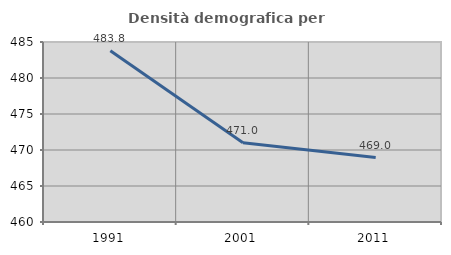
| Category | Densità demografica |
|---|---|
| 1991.0 | 483.77 |
| 2001.0 | 470.993 |
| 2011.0 | 468.954 |